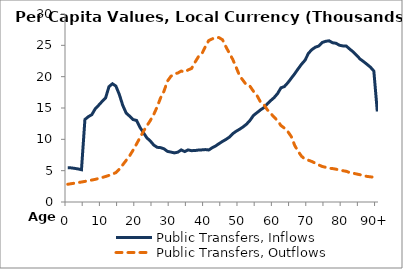
| Category | Public Transfers, Inflows | Public Transfers, Outflows |
|---|---|---|
| 0 | 5456.822 | 2829.954 |
|  | 5444.94 | 2917.431 |
| 2 | 5366.268 | 3004.909 |
| 3 | 5275.117 | 3092.387 |
| 4 | 5148.746 | 3186.798 |
| 5 | 13165.078 | 3285.774 |
| 6 | 13618.959 | 3392.263 |
| 7 | 13933.134 | 3505.998 |
| 8 | 14871.556 | 3616.182 |
| 9 | 15446.235 | 3751.077 |
| 10 | 16048.037 | 3903.645 |
| 11 | 16591.955 | 4067.853 |
| 12 | 18412.053 | 4254.637 |
| 13 | 18867.606 | 4457.026 |
| 14 | 18502.914 | 4688.335 |
| 15 | 17159.602 | 5224.888 |
| 16 | 15424.297 | 5935.248 |
| 17 | 14187.364 | 6647.627 |
| 18 | 13697.915 | 7372.304 |
| 19 | 13154.716 | 8269.828 |
| 20 | 13016.427 | 9248.276 |
| 21 | 11921.28 | 10256.957 |
| 22 | 11067.21 | 11268.146 |
| 23 | 10236.206 | 12139.897 |
| 24 | 9744.725 | 12989.963 |
| 25 | 9095.378 | 13959.956 |
| 26 | 8727.991 | 15171.431 |
| 27 | 8676.09 | 16622.142 |
| 28 | 8481.456 | 17699.284 |
| 29 | 8079.118 | 19299.024 |
| 30 | 7964.875 | 20059.362 |
| 31 | 7836.636 | 20437.697 |
| 32 | 7946.731 | 20581.142 |
| 33 | 8311.384 | 20895.004 |
| 34 | 8049.069 | 20721.61 |
| 35 | 8309.348 | 21077.232 |
| 36 | 8192.361 | 21304.437 |
| 37 | 8211.649 | 22297.901 |
| 38 | 8288.158 | 23186.169 |
| 39 | 8316.51 | 23646.468 |
| 40 | 8366.1 | 24765.967 |
| 41 | 8300.131 | 25766.181 |
| 42 | 8652.808 | 26023.953 |
| 43 | 8943.415 | 26273.974 |
| 44 | 9315.894 | 26229.235 |
| 45 | 9665.517 | 25894.93 |
| 46 | 9980.48 | 24754.965 |
| 47 | 10354.685 | 23748.414 |
| 48 | 10912.162 | 22729.914 |
| 49 | 11298.928 | 21441.748 |
| 50 | 11621.149 | 20132.199 |
| 51 | 11990.663 | 19380.322 |
| 52 | 12425.644 | 18655.685 |
| 53 | 13027.533 | 18462.438 |
| 54 | 13809.882 | 17670.16 |
| 55 | 14243.405 | 17014.349 |
| 56 | 14680.143 | 16003.427 |
| 57 | 15044.641 | 15569.838 |
| 58 | 15652.742 | 14746.062 |
| 59 | 16174.026 | 14144.501 |
| 60 | 16656.182 | 13540.002 |
| 61 | 17293.627 | 12982.668 |
| 62 | 18216.626 | 12194.064 |
| 63 | 18427.37 | 11796.034 |
| 64 | 19033.861 | 11238.946 |
| 65 | 19749.596 | 10431.275 |
| 66 | 20478.277 | 9014.38 |
| 67 | 21255.733 | 8064.371 |
| 68 | 22002.619 | 7293.735 |
| 69 | 22625.989 | 6830.43 |
| 70 | 23740.738 | 6653.899 |
| 71 | 24319.863 | 6462.665 |
| 72 | 24705.348 | 6185.541 |
| 73 | 24897.603 | 5907.394 |
| 74 | 25456.624 | 5667.489 |
| 75 | 25645.722 | 5538.317 |
| 76 | 25724.693 | 5382.618 |
| 77 | 25410.464 | 5332.688 |
| 78 | 25328.729 | 5238.046 |
| 79 | 25015.652 | 5110.484 |
| 80 | 24905.41 | 4997.306 |
| 81 | 24876.659 | 4895.069 |
| 82 | 24397.775 | 4695.538 |
| 83 | 23947.641 | 4587.724 |
| 84 | 23406.958 | 4467.588 |
| 85 | 22812.387 | 4354.662 |
| 86 | 22409.122 | 4197.764 |
| 87 | 21973.114 | 4086.132 |
| 88 | 21518.838 | 4014.508 |
| 89 | 20897.729 | 3959.019 |
| 90+ | 14444.802 | 3792.082 |